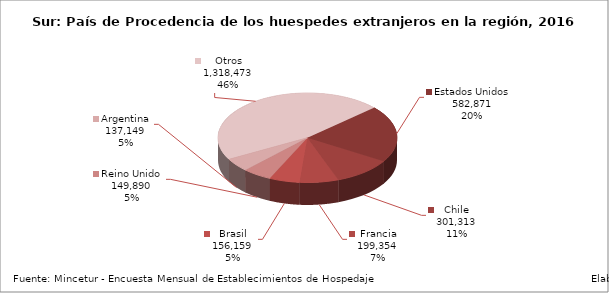
| Category | Series 0 |
|---|---|
| Estados Unidos | 582871 |
| Chile | 301313 |
| Francia | 199354 |
| Brasil | 156159 |
| Reino Unido | 149890 |
| Argentina | 137149 |
| Otros | 1318473 |